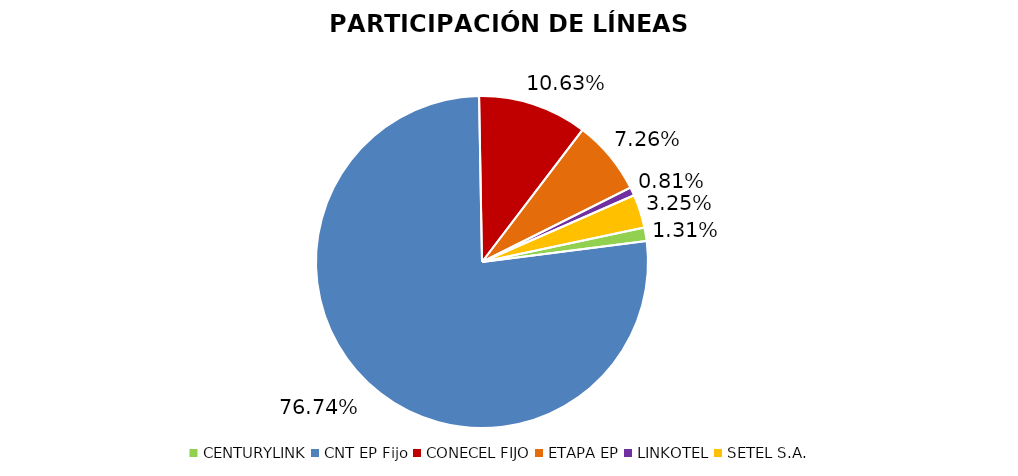
| Category | Participación en el Mercado |
|---|---|
| CENTURYLINK | 0.013 |
| CNT EP Fijo | 0.767 |
| CONECEL FIJO | 0.106 |
| ETAPA EP | 0.073 |
| LINKOTEL | 0.008 |
| SETEL S.A. | 0.033 |